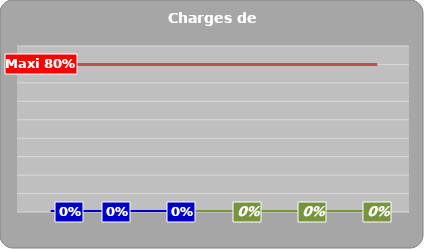
| Category | Series 0 | Maxi |
|---|---|---|
|   | 0 | 0.8 |
|   | 0 | 0.8 |
|   | 0 | 0.8 |
|   | 0 | 0.8 |
|   | 0 | 0.8 |
|   | 0 | 0.8 |